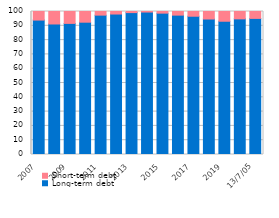
| Category | Long-term debt | Short-term debt |
|---|---|---|
| 2007 | 93.994 | 6.006 |
| 2008 | 91.269 | 8.731 |
| 2009 | 91.683 | 8.317 |
| 2010 | 92.524 | 7.476 |
| 2011 | 97.465 | 2.535 |
| 2012 | 98.226 | 1.774 |
| 2013 | 99.234 | 0.766 |
| 2014 | 99.616 | 0.384 |
| 2015 | 98.846 | 1.154 |
| 2016 | 97.463 | 2.537 |
| 2017 | 96.693 | 3.307 |
| 2018 | 94.744 | 5.256 |
| 2019 | 93.187 | 6.813 |
| 2020 | 94.85 | 5.15 |
| 2021 | 95.178 | 4.822 |